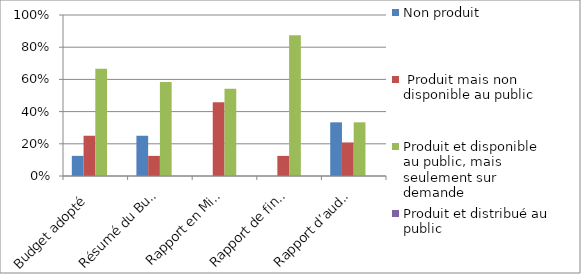
| Category | Non produit |  Produit mais non disponible au public | Produit et disponible au public, mais seulement sur demande | Produit et distribué au public |
|---|---|---|---|---|
| Budget adopté  | 0.125 | 0.25 | 0.667 | 0 |
|  Résumé du Budget  | 0.25 | 0.125 | 0.583 | 0 |
|  Rapport en Milieu d’année | 0 | 0.458 | 0.542 | 0 |
|  Rapport de fin d’année  | 0 | 0.125 | 0.875 | 0 |
|  Rapport d’audit (reddition des comptes) | 0.333 | 0.208 | 0.333 | 0 |